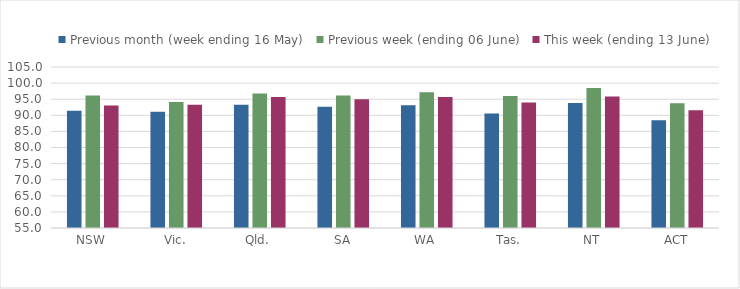
| Category | Previous month (week ending 16 May) | Previous week (ending 06 June) | This week (ending 13 June) |
|---|---|---|---|
| NSW | 91.445 | 96.181 | 93.067 |
| Vic. | 91.123 | 94.114 | 93.294 |
| Qld. | 93.281 | 96.791 | 95.68 |
| SA | 92.665 | 96.145 | 94.969 |
| WA | 93.126 | 97.129 | 95.709 |
| Tas. | 90.543 | 95.981 | 93.958 |
| NT | 93.858 | 98.514 | 95.871 |
| ACT | 88.494 | 93.747 | 91.533 |